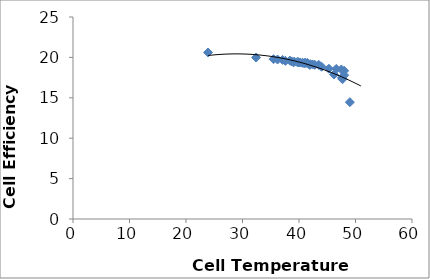
| Category | Efficiency of Cell |
|---|---|
| 23.9 | 20.612 |
| 32.4 | 19.983 |
| 35.5 | 19.784 |
| 36.2 | 19.737 |
| 37.1 | 19.693 |
| 37.6 | 19.569 |
| 38.4 | 19.597 |
| 38.7 | 19.504 |
| 39.2 | 19.459 |
| 39.0 | 19.41 |
| 39.7 | 19.424 |
| 39.8 | 19.395 |
| 39.9 | 19.407 |
| 40.6 | 19.328 |
| 41.0 | 19.314 |
| 41.2 | 19.322 |
| 40.2 | 19.36 |
| 40.9 | 19.295 |
| 41.5 | 19.307 |
| 41.5 | 19.252 |
| 42.0 | 19.16 |
| 42.8 | 19.08 |
| 41.9 | 19.064 |
| 44.0 | 18.841 |
| 42.4 | 19.131 |
| 43.5 | 19.08 |
| 45.3 | 18.599 |
| 46.6 | 18.579 |
| 47.5 | 18.506 |
| 46.2 | 17.878 |
| 47.6 | 17.481 |
| 48.0 | 17.792 |
| 48.0 | 18.343 |
| 47.7 | 17.3 |
| 47.7 | 17.436 |
| 49.0 | 14.461 |